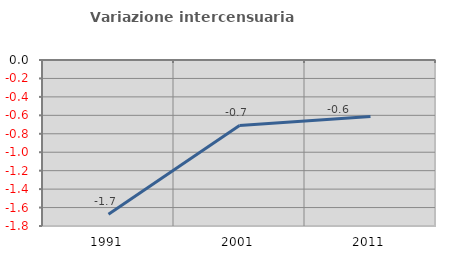
| Category | Variazione intercensuaria annua |
|---|---|
| 1991.0 | -1.672 |
| 2001.0 | -0.709 |
| 2011.0 | -0.612 |